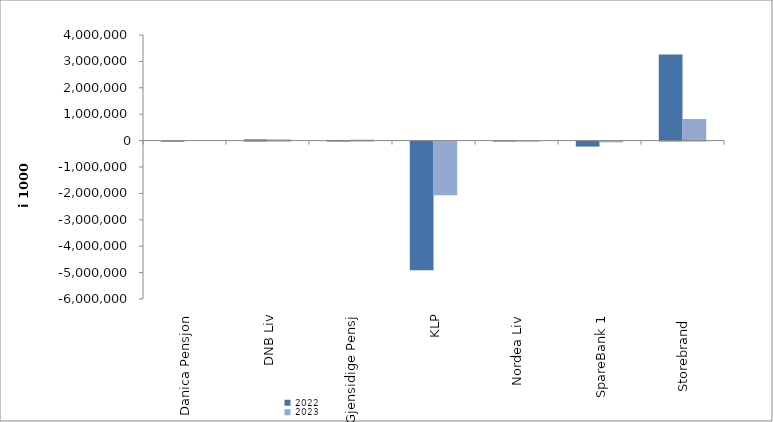
| Category | 2022 | 2023 |
|---|---|---|
| Danica Pensjon | -3752.943 | 0 |
| DNB Liv | 47572.902 | 46187 |
| Gjensidige Pensj | 24480 | 36306 |
| KLP | -4875400.225 | -2034368.132 |
| Nordea Liv | -700.252 | -1911.312 |
| SpareBank 1 | -188515.813 | -25785.912 |
| Storebrand  | 3263672.068 | 819261.934 |